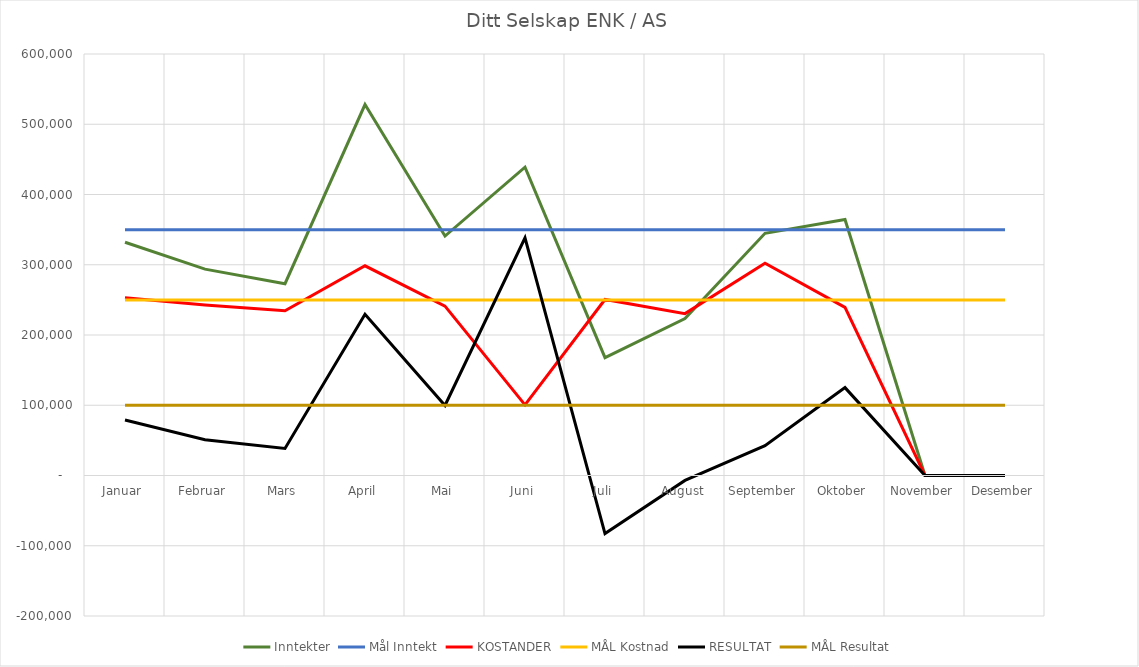
| Category | Inntekter | Mål Inntekt | KOSTANDER | MÅL Kostnad | RESULTAT | MÅL Resultat |
|---|---|---|---|---|---|---|
| Januar | 332038.5 | 350000 | 253024.68 | 250000 | 79013.82 | 100000 |
| Februar | 293756.4 | 350000 | 242737.77 | 250000 | 51018.63 | 100000 |
| Mars | 273016.2 | 350000 | 234577.72 | 250000 | 38438.48 | 100000 |
| April | 528065.5 | 350000 | 298495.67 | 250000 | 229569.83 | 100000 |
| Mai | 340848 | 350000 | 241167.2 | 250000 | 99680.8 | 100000 |
| Juni | 438955.28 | 350000 | 100500.17 | 250000 | 338455.11 | 100000 |
| Juli | 167846 | 350000 | 250554.73 | 250000 | -82708.73 | 100000 |
| August | 223490.8 | 350000 | 230438.15 | 250000 | -6947.35 | 100000 |
| September | 344782.6 | 350000 | 302232.77 | 250000 | 42549.83 | 100000 |
| Oktober | 364496.6 | 350000 | 239401.73 | 250000 | 125094.87 | 100000 |
| November | 0 | 350000 | 0 | 250000 | 0 | 100000 |
| Desember | 0 | 350000 | 0 | 250000 | 0 | 100000 |